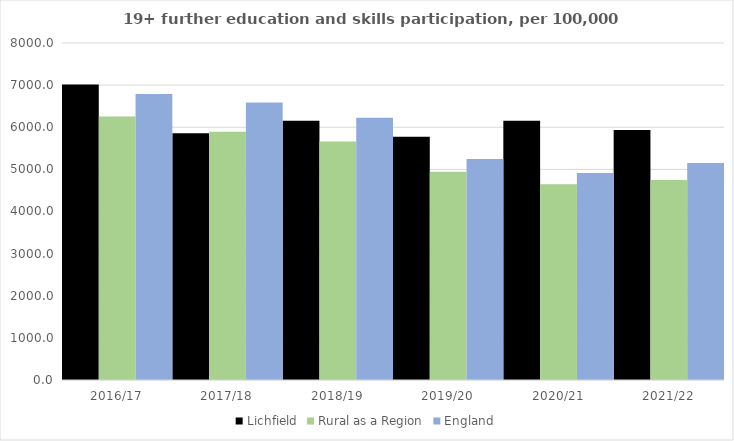
| Category | Lichfield | Rural as a Region | England |
|---|---|---|---|
| 2016/17 | 7017 | 6253.401 | 6788 |
| 2017/18 | 5855 | 5892.029 | 6588 |
| 2018/19 | 6154 | 5661.873 | 6227 |
| 2019/20 | 5772 | 4943.801 | 5244 |
| 2020/21 | 6157 | 4646.727 | 4913 |
| 2021/22 | 5934 | 4747.049 | 5151 |